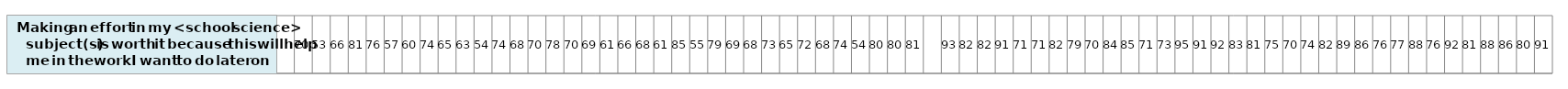
| Category | Making an effort in my <school science> subject(s) is worth it because this will help me in the work I want to do later on |
|---|---|
| nan | 1 |
| 70.00595443256145 | 1 |
| 53.33514243022241 | 1 |
| 65.74823789038669 | 1 |
| 81.02634566088844 | 1 |
| 76.37587386099686 | 1 |
| 56.61299665144431 | 1 |
| 59.99167519220553 | 1 |
| 74.05905319927881 | 1 |
| 64.99094105991382 | 1 |
| 63.42120126465479 | 1 |
| 54.36429191234645 | 1 |
| 73.68227114718657 | 1 |
| 68.28878120487734 | 1 |
| 69.5634488809988 | 1 |
| 78.06282732747533 | 1 |
| 69.81970965511633 | 1 |
| 69.35053518656534 | 1 |
| 61.38855797299318 | 1 |
| 66.05484657651091 | 1 |
| 68.32185517668728 | 1 |
| 60.78378931111653 | 1 |
| 85.02935116227631 | 1 |
| 54.8650719494624 | 1 |
| 78.76739721989111 | 1 |
| 68.70074746555271 | 1 |
| 68.39760273078501 | 1 |
| 73.21423826069604 | 1 |
| 65.01266162796044 | 1 |
| 72.31648606907925 | 1 |
| 68.18673052614565 | 1 |
| 73.98009617053764 | 1 |
| 54.454242553085 | 1 |
| 80.39704411440127 | 1 |
| 79.74349681640601 | 1 |
| 80.55184696963966 | 1 |
| nan | 1 |
| 93.14472347242817 | 1 |
| 81.86692059714625 | 1 |
| 81.9114291051571 | 1 |
| 90.58366567263522 | 1 |
| 71.20872521277398 | 1 |
| 70.51330273772066 | 1 |
| 82.43241456363644 | 1 |
| 78.78295398027898 | 1 |
| 70.13100196360831 | 1 |
| 84.29280113002112 | 1 |
| 84.6470986979969 | 1 |
| 71.25655006779962 | 1 |
| 72.60979947261754 | 1 |
| 95.4466963691752 | 1 |
| 90.54929481337439 | 1 |
| 91.50054391242261 | 1 |
| 83.4841959013978 | 1 |
| 80.8053351142481 | 1 |
| 75.21979471602546 | 1 |
| 70.06082443739334 | 1 |
| 74.27334012486256 | 1 |
| 82.40997854679209 | 1 |
| 88.886211871974 | 1 |
| 85.6341585094383 | 1 |
| 75.87043567830096 | 1 |
| 76.82771113513193 | 1 |
| 88.2236911272154 | 1 |
| 75.50913401237989 | 1 |
| 91.78836043251953 | 1 |
| 81.12783425232621 | 1 |
| 88.33559053845302 | 1 |
| 86.32277038923675 | 1 |
| 79.5507563766881 | 1 |
| 91.02450197946335 | 1 |